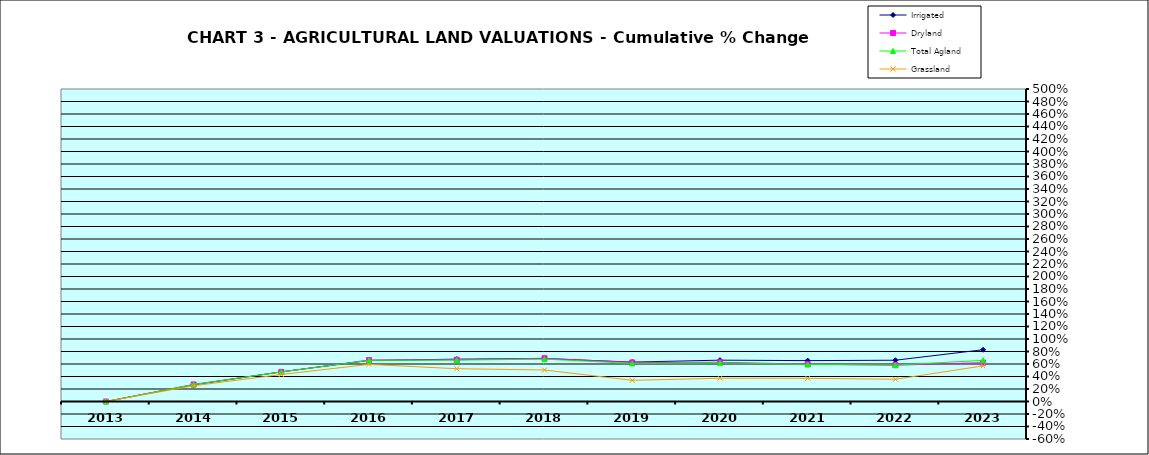
| Category | Irrigated | Dryland | Total Agland | Grassland |
|---|---|---|---|---|
| 2013.0 | 0 | 0 | 0 | 0 |
| 2014.0 | 0.266 | 0.273 | 0.271 | 0.252 |
| 2015.0 | 0.474 | 0.474 | 0.473 | 0.432 |
| 2016.0 | 0.657 | 0.662 | 0.659 | 0.594 |
| 2017.0 | 0.677 | 0.668 | 0.662 | 0.524 |
| 2018.0 | 0.687 | 0.692 | 0.678 | 0.504 |
| 2019.0 | 0.63 | 0.625 | 0.609 | 0.339 |
| 2020.0 | 0.661 | 0.628 | 0.619 | 0.372 |
| 2021.0 | 0.654 | 0.596 | 0.593 | 0.371 |
| 2022.0 | 0.66 | 0.581 | 0.583 | 0.356 |
| 2023.0 | 0.828 | 0.621 | 0.658 | 0.57 |